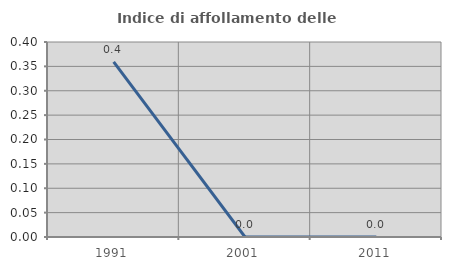
| Category | Indice di affollamento delle abitazioni  |
|---|---|
| 1991.0 | 0.359 |
| 2001.0 | 0 |
| 2011.0 | 0 |